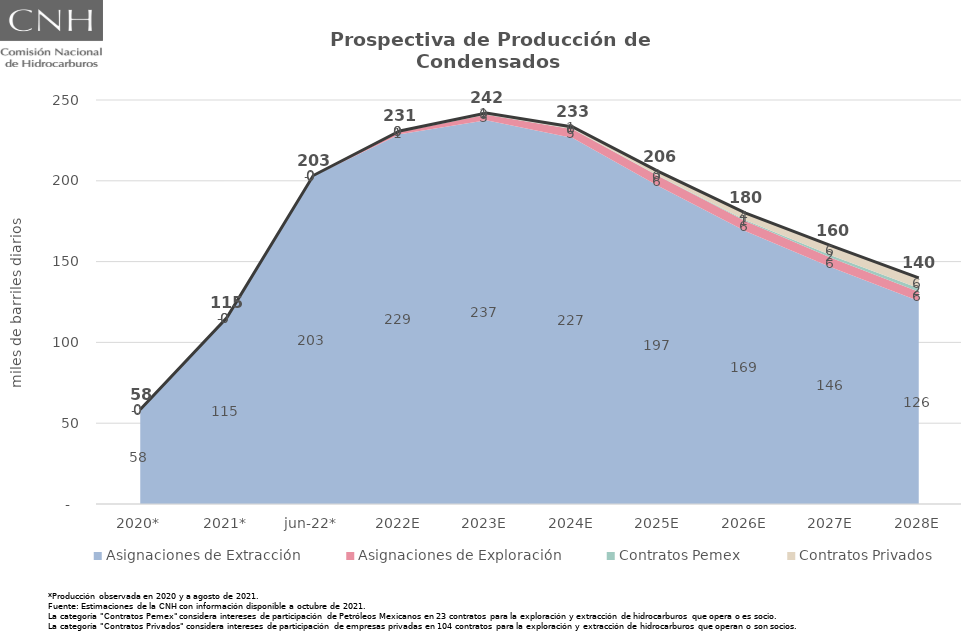
| Category | Total |
|---|---|
| 2020* | 58.421 |
| 2021* | 115.166 |
| jun-22* | 203.259 |
| 2022E | 230.82 |
| 2023E | 242.007 |
| 2024E | 233.291 |
| 2025E | 205.534 |
| 2026E | 180.041 |
| 2027E | 159.589 |
| 2028E | 139.966 |